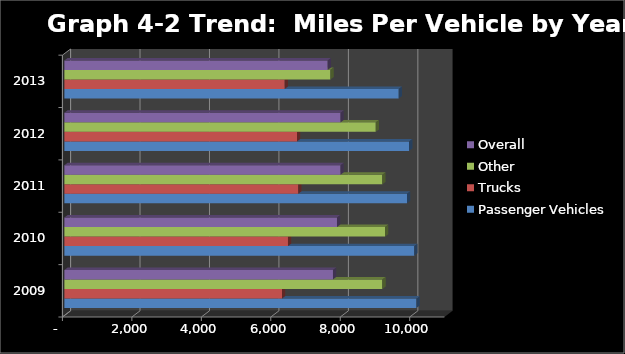
| Category | Passenger Vehicles | Trucks | Other | Overall |
|---|---|---|---|---|
| 2009.0 | 10137.8 | 6267.5 | 9156.8 | 7733.7 |
| 2010.0 | 10076.8 | 6438 | 9234.3 | 7849.1 |
| 2011.0 | 9865.8 | 6736.1 | 9156.2 | 7953.6 |
| 2012.0 | 9927 | 6700.7 | 8966.8 | 7954.4 |
| 2013.0 | 9627.2 | 6344.3 | 7659.9 | 7580.8 |